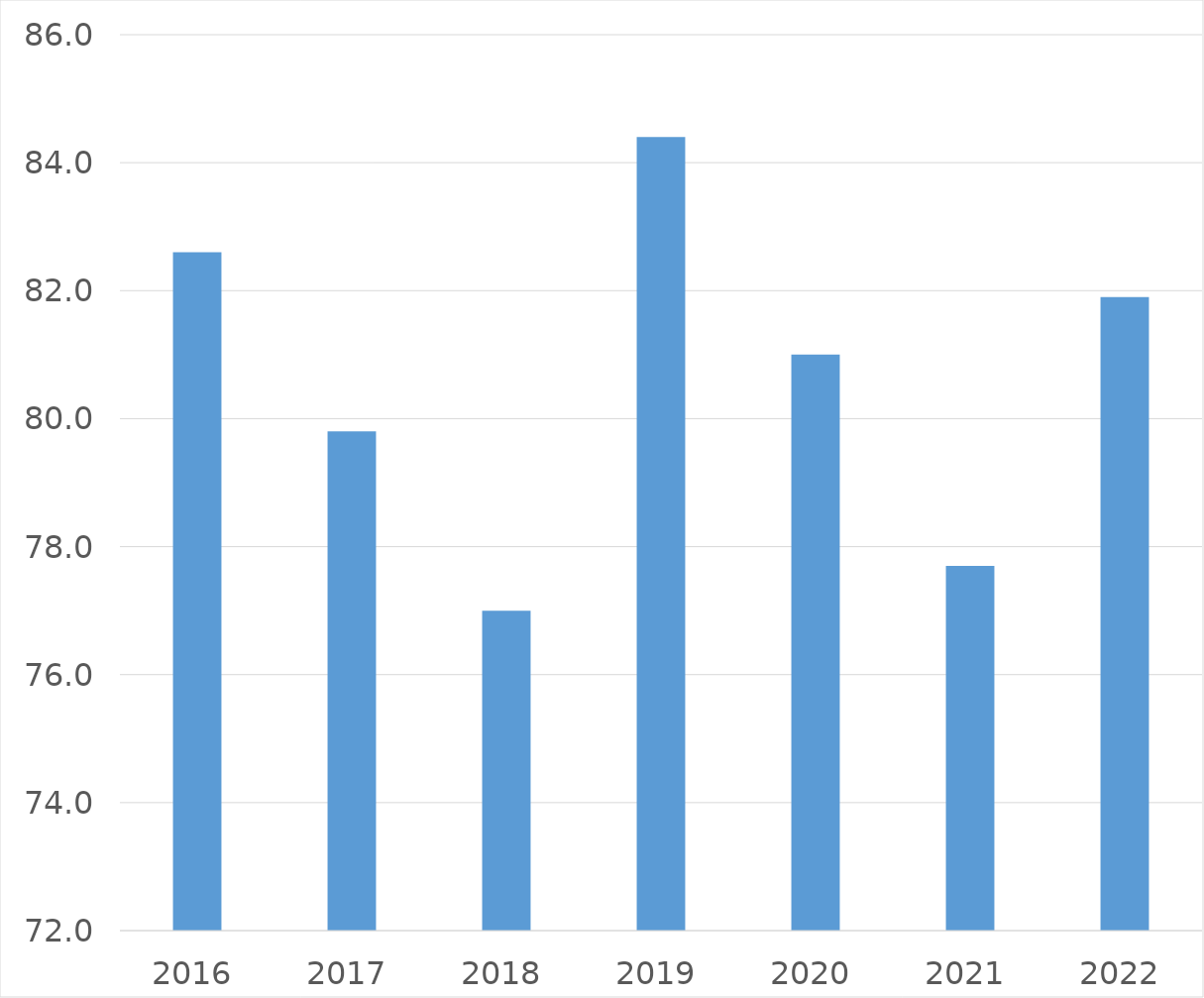
| Category | Series 0 |
|---|---|
| 2016 | 82.6 |
| 2017 | 79.8 |
| 2018 | 77 |
| 2019 | 84.4 |
| 2020 | 81 |
| 2021 | 77.7 |
| 2022 | 81.9 |